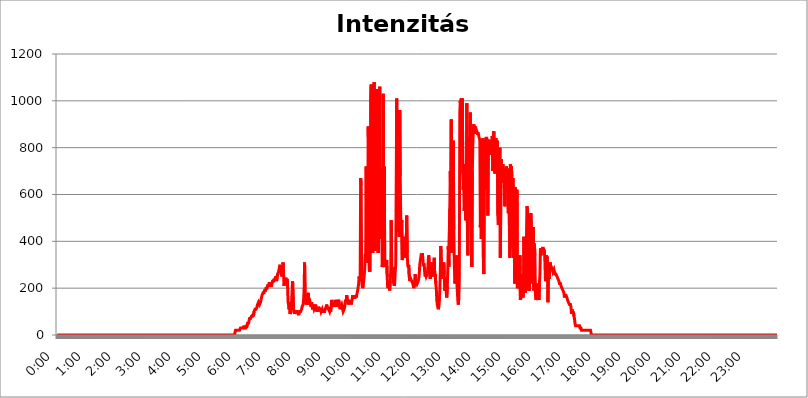
| Category | Intenzitás (W/m2) |
|---|---|
| 0.0 | 0 |
| 0.0006944444444444445 | 0 |
| 0.001388888888888889 | 0 |
| 0.0020833333333333333 | 0 |
| 0.002777777777777778 | 0 |
| 0.003472222222222222 | 0 |
| 0.004166666666666667 | 0 |
| 0.004861111111111111 | 0 |
| 0.005555555555555556 | 0 |
| 0.0062499999999999995 | 0 |
| 0.006944444444444444 | 0 |
| 0.007638888888888889 | 0 |
| 0.008333333333333333 | 0 |
| 0.009027777777777779 | 0 |
| 0.009722222222222222 | 0 |
| 0.010416666666666666 | 0 |
| 0.011111111111111112 | 0 |
| 0.011805555555555555 | 0 |
| 0.012499999999999999 | 0 |
| 0.013194444444444444 | 0 |
| 0.013888888888888888 | 0 |
| 0.014583333333333332 | 0 |
| 0.015277777777777777 | 0 |
| 0.015972222222222224 | 0 |
| 0.016666666666666666 | 0 |
| 0.017361111111111112 | 0 |
| 0.018055555555555557 | 0 |
| 0.01875 | 0 |
| 0.019444444444444445 | 0 |
| 0.02013888888888889 | 0 |
| 0.020833333333333332 | 0 |
| 0.02152777777777778 | 0 |
| 0.022222222222222223 | 0 |
| 0.02291666666666667 | 0 |
| 0.02361111111111111 | 0 |
| 0.024305555555555556 | 0 |
| 0.024999999999999998 | 0 |
| 0.025694444444444447 | 0 |
| 0.02638888888888889 | 0 |
| 0.027083333333333334 | 0 |
| 0.027777777777777776 | 0 |
| 0.02847222222222222 | 0 |
| 0.029166666666666664 | 0 |
| 0.029861111111111113 | 0 |
| 0.030555555555555555 | 0 |
| 0.03125 | 0 |
| 0.03194444444444445 | 0 |
| 0.03263888888888889 | 0 |
| 0.03333333333333333 | 0 |
| 0.034027777777777775 | 0 |
| 0.034722222222222224 | 0 |
| 0.035416666666666666 | 0 |
| 0.036111111111111115 | 0 |
| 0.03680555555555556 | 0 |
| 0.0375 | 0 |
| 0.03819444444444444 | 0 |
| 0.03888888888888889 | 0 |
| 0.03958333333333333 | 0 |
| 0.04027777777777778 | 0 |
| 0.04097222222222222 | 0 |
| 0.041666666666666664 | 0 |
| 0.042361111111111106 | 0 |
| 0.04305555555555556 | 0 |
| 0.043750000000000004 | 0 |
| 0.044444444444444446 | 0 |
| 0.04513888888888889 | 0 |
| 0.04583333333333334 | 0 |
| 0.04652777777777778 | 0 |
| 0.04722222222222222 | 0 |
| 0.04791666666666666 | 0 |
| 0.04861111111111111 | 0 |
| 0.049305555555555554 | 0 |
| 0.049999999999999996 | 0 |
| 0.05069444444444445 | 0 |
| 0.051388888888888894 | 0 |
| 0.052083333333333336 | 0 |
| 0.05277777777777778 | 0 |
| 0.05347222222222222 | 0 |
| 0.05416666666666667 | 0 |
| 0.05486111111111111 | 0 |
| 0.05555555555555555 | 0 |
| 0.05625 | 0 |
| 0.05694444444444444 | 0 |
| 0.057638888888888885 | 0 |
| 0.05833333333333333 | 0 |
| 0.05902777777777778 | 0 |
| 0.059722222222222225 | 0 |
| 0.06041666666666667 | 0 |
| 0.061111111111111116 | 0 |
| 0.06180555555555556 | 0 |
| 0.0625 | 0 |
| 0.06319444444444444 | 0 |
| 0.06388888888888888 | 0 |
| 0.06458333333333334 | 0 |
| 0.06527777777777778 | 0 |
| 0.06597222222222222 | 0 |
| 0.06666666666666667 | 0 |
| 0.06736111111111111 | 0 |
| 0.06805555555555555 | 0 |
| 0.06874999999999999 | 0 |
| 0.06944444444444443 | 0 |
| 0.07013888888888889 | 0 |
| 0.07083333333333333 | 0 |
| 0.07152777777777779 | 0 |
| 0.07222222222222223 | 0 |
| 0.07291666666666667 | 0 |
| 0.07361111111111111 | 0 |
| 0.07430555555555556 | 0 |
| 0.075 | 0 |
| 0.07569444444444444 | 0 |
| 0.0763888888888889 | 0 |
| 0.07708333333333334 | 0 |
| 0.07777777777777778 | 0 |
| 0.07847222222222222 | 0 |
| 0.07916666666666666 | 0 |
| 0.0798611111111111 | 0 |
| 0.08055555555555556 | 0 |
| 0.08125 | 0 |
| 0.08194444444444444 | 0 |
| 0.08263888888888889 | 0 |
| 0.08333333333333333 | 0 |
| 0.08402777777777777 | 0 |
| 0.08472222222222221 | 0 |
| 0.08541666666666665 | 0 |
| 0.08611111111111112 | 0 |
| 0.08680555555555557 | 0 |
| 0.08750000000000001 | 0 |
| 0.08819444444444445 | 0 |
| 0.08888888888888889 | 0 |
| 0.08958333333333333 | 0 |
| 0.09027777777777778 | 0 |
| 0.09097222222222222 | 0 |
| 0.09166666666666667 | 0 |
| 0.09236111111111112 | 0 |
| 0.09305555555555556 | 0 |
| 0.09375 | 0 |
| 0.09444444444444444 | 0 |
| 0.09513888888888888 | 0 |
| 0.09583333333333333 | 0 |
| 0.09652777777777777 | 0 |
| 0.09722222222222222 | 0 |
| 0.09791666666666667 | 0 |
| 0.09861111111111111 | 0 |
| 0.09930555555555555 | 0 |
| 0.09999999999999999 | 0 |
| 0.10069444444444443 | 0 |
| 0.1013888888888889 | 0 |
| 0.10208333333333335 | 0 |
| 0.10277777777777779 | 0 |
| 0.10347222222222223 | 0 |
| 0.10416666666666667 | 0 |
| 0.10486111111111111 | 0 |
| 0.10555555555555556 | 0 |
| 0.10625 | 0 |
| 0.10694444444444444 | 0 |
| 0.1076388888888889 | 0 |
| 0.10833333333333334 | 0 |
| 0.10902777777777778 | 0 |
| 0.10972222222222222 | 0 |
| 0.1111111111111111 | 0 |
| 0.11180555555555556 | 0 |
| 0.11180555555555556 | 0 |
| 0.1125 | 0 |
| 0.11319444444444444 | 0 |
| 0.11388888888888889 | 0 |
| 0.11458333333333333 | 0 |
| 0.11527777777777777 | 0 |
| 0.11597222222222221 | 0 |
| 0.11666666666666665 | 0 |
| 0.1173611111111111 | 0 |
| 0.11805555555555557 | 0 |
| 0.11944444444444445 | 0 |
| 0.12013888888888889 | 0 |
| 0.12083333333333333 | 0 |
| 0.12152777777777778 | 0 |
| 0.12222222222222223 | 0 |
| 0.12291666666666667 | 0 |
| 0.12291666666666667 | 0 |
| 0.12361111111111112 | 0 |
| 0.12430555555555556 | 0 |
| 0.125 | 0 |
| 0.12569444444444444 | 0 |
| 0.12638888888888888 | 0 |
| 0.12708333333333333 | 0 |
| 0.16875 | 0 |
| 0.12847222222222224 | 0 |
| 0.12916666666666668 | 0 |
| 0.12986111111111112 | 0 |
| 0.13055555555555556 | 0 |
| 0.13125 | 0 |
| 0.13194444444444445 | 0 |
| 0.1326388888888889 | 0 |
| 0.13333333333333333 | 0 |
| 0.13402777777777777 | 0 |
| 0.13402777777777777 | 0 |
| 0.13472222222222222 | 0 |
| 0.13541666666666666 | 0 |
| 0.1361111111111111 | 0 |
| 0.13749999999999998 | 0 |
| 0.13819444444444443 | 0 |
| 0.1388888888888889 | 0 |
| 0.13958333333333334 | 0 |
| 0.14027777777777778 | 0 |
| 0.14097222222222222 | 0 |
| 0.14166666666666666 | 0 |
| 0.1423611111111111 | 0 |
| 0.14305555555555557 | 0 |
| 0.14375000000000002 | 0 |
| 0.14444444444444446 | 0 |
| 0.1451388888888889 | 0 |
| 0.1451388888888889 | 0 |
| 0.14652777777777778 | 0 |
| 0.14722222222222223 | 0 |
| 0.14791666666666667 | 0 |
| 0.1486111111111111 | 0 |
| 0.14930555555555555 | 0 |
| 0.15 | 0 |
| 0.15069444444444444 | 0 |
| 0.15138888888888888 | 0 |
| 0.15208333333333332 | 0 |
| 0.15277777777777776 | 0 |
| 0.15347222222222223 | 0 |
| 0.15416666666666667 | 0 |
| 0.15486111111111112 | 0 |
| 0.15555555555555556 | 0 |
| 0.15625 | 0 |
| 0.15694444444444444 | 0 |
| 0.15763888888888888 | 0 |
| 0.15833333333333333 | 0 |
| 0.15902777777777777 | 0 |
| 0.15972222222222224 | 0 |
| 0.16041666666666668 | 0 |
| 0.16111111111111112 | 0 |
| 0.16180555555555556 | 0 |
| 0.1625 | 0 |
| 0.16319444444444445 | 0 |
| 0.1638888888888889 | 0 |
| 0.16458333333333333 | 0 |
| 0.16527777777777777 | 0 |
| 0.16597222222222222 | 0 |
| 0.16666666666666666 | 0 |
| 0.1673611111111111 | 0 |
| 0.16805555555555554 | 0 |
| 0.16874999999999998 | 0 |
| 0.16944444444444443 | 0 |
| 0.17013888888888887 | 0 |
| 0.1708333333333333 | 0 |
| 0.17152777777777775 | 0 |
| 0.17222222222222225 | 0 |
| 0.1729166666666667 | 0 |
| 0.17361111111111113 | 0 |
| 0.17430555555555557 | 0 |
| 0.17500000000000002 | 0 |
| 0.17569444444444446 | 0 |
| 0.1763888888888889 | 0 |
| 0.17708333333333334 | 0 |
| 0.17777777777777778 | 0 |
| 0.17847222222222223 | 0 |
| 0.17916666666666667 | 0 |
| 0.1798611111111111 | 0 |
| 0.18055555555555555 | 0 |
| 0.18125 | 0 |
| 0.18194444444444444 | 0 |
| 0.1826388888888889 | 0 |
| 0.18333333333333335 | 0 |
| 0.1840277777777778 | 0 |
| 0.18472222222222223 | 0 |
| 0.18541666666666667 | 0 |
| 0.18611111111111112 | 0 |
| 0.18680555555555556 | 0 |
| 0.1875 | 0 |
| 0.18819444444444444 | 0 |
| 0.18888888888888888 | 0 |
| 0.18958333333333333 | 0 |
| 0.19027777777777777 | 0 |
| 0.1909722222222222 | 0 |
| 0.19166666666666665 | 0 |
| 0.19236111111111112 | 0 |
| 0.19305555555555554 | 0 |
| 0.19375 | 0 |
| 0.19444444444444445 | 0 |
| 0.1951388888888889 | 0 |
| 0.19583333333333333 | 0 |
| 0.19652777777777777 | 0 |
| 0.19722222222222222 | 0 |
| 0.19791666666666666 | 0 |
| 0.1986111111111111 | 0 |
| 0.19930555555555554 | 0 |
| 0.19999999999999998 | 0 |
| 0.20069444444444443 | 0 |
| 0.20138888888888887 | 0 |
| 0.2020833333333333 | 0 |
| 0.2027777777777778 | 0 |
| 0.2034722222222222 | 0 |
| 0.2041666666666667 | 0 |
| 0.20486111111111113 | 0 |
| 0.20555555555555557 | 0 |
| 0.20625000000000002 | 0 |
| 0.20694444444444446 | 0 |
| 0.2076388888888889 | 0 |
| 0.20833333333333334 | 0 |
| 0.20902777777777778 | 0 |
| 0.20972222222222223 | 0 |
| 0.21041666666666667 | 0 |
| 0.2111111111111111 | 0 |
| 0.21180555555555555 | 0 |
| 0.2125 | 0 |
| 0.21319444444444444 | 0 |
| 0.2138888888888889 | 0 |
| 0.21458333333333335 | 0 |
| 0.2152777777777778 | 0 |
| 0.21597222222222223 | 0 |
| 0.21666666666666667 | 0 |
| 0.21736111111111112 | 0 |
| 0.21805555555555556 | 0 |
| 0.21875 | 0 |
| 0.21944444444444444 | 0 |
| 0.22013888888888888 | 0 |
| 0.22083333333333333 | 0 |
| 0.22152777777777777 | 0 |
| 0.2222222222222222 | 0 |
| 0.22291666666666665 | 0 |
| 0.2236111111111111 | 0 |
| 0.22430555555555556 | 0 |
| 0.225 | 0 |
| 0.22569444444444445 | 0 |
| 0.2263888888888889 | 0 |
| 0.22708333333333333 | 0 |
| 0.22777777777777777 | 0 |
| 0.22847222222222222 | 0 |
| 0.22916666666666666 | 0 |
| 0.2298611111111111 | 0 |
| 0.23055555555555554 | 0 |
| 0.23124999999999998 | 0 |
| 0.23194444444444443 | 0 |
| 0.23263888888888887 | 0 |
| 0.2333333333333333 | 0 |
| 0.2340277777777778 | 0 |
| 0.2347222222222222 | 0 |
| 0.2354166666666667 | 0 |
| 0.23611111111111113 | 0 |
| 0.23680555555555557 | 0 |
| 0.23750000000000002 | 0 |
| 0.23819444444444446 | 0 |
| 0.2388888888888889 | 0 |
| 0.23958333333333334 | 0 |
| 0.24027777777777778 | 0 |
| 0.24097222222222223 | 0 |
| 0.24166666666666667 | 0 |
| 0.2423611111111111 | 0 |
| 0.24305555555555555 | 0 |
| 0.24375 | 0 |
| 0.24444444444444446 | 0 |
| 0.24513888888888888 | 0 |
| 0.24583333333333335 | 0 |
| 0.2465277777777778 | 0 |
| 0.24722222222222223 | 20 |
| 0.24791666666666667 | 20 |
| 0.24861111111111112 | 20 |
| 0.24930555555555556 | 20 |
| 0.25 | 20 |
| 0.25069444444444444 | 20 |
| 0.2513888888888889 | 20 |
| 0.2520833333333333 | 20 |
| 0.25277777777777777 | 20 |
| 0.2534722222222222 | 20 |
| 0.25416666666666665 | 30 |
| 0.2548611111111111 | 30 |
| 0.2555555555555556 | 30 |
| 0.25625000000000003 | 30 |
| 0.2569444444444445 | 30 |
| 0.2576388888888889 | 30 |
| 0.25833333333333336 | 30 |
| 0.2590277777777778 | 40 |
| 0.25972222222222224 | 30 |
| 0.2604166666666667 | 30 |
| 0.2611111111111111 | 30 |
| 0.26180555555555557 | 40 |
| 0.2625 | 30 |
| 0.26319444444444445 | 30 |
| 0.2638888888888889 | 50 |
| 0.26458333333333334 | 50 |
| 0.2652777777777778 | 50 |
| 0.2659722222222222 | 60 |
| 0.26666666666666666 | 70 |
| 0.2673611111111111 | 70 |
| 0.26805555555555555 | 70 |
| 0.26875 | 70 |
| 0.26944444444444443 | 80 |
| 0.2701388888888889 | 80 |
| 0.2708333333333333 | 80 |
| 0.27152777777777776 | 90 |
| 0.2722222222222222 | 80 |
| 0.27291666666666664 | 100 |
| 0.2736111111111111 | 100 |
| 0.2743055555555555 | 110 |
| 0.27499999999999997 | 110 |
| 0.27569444444444446 | 110 |
| 0.27638888888888885 | 110 |
| 0.27708333333333335 | 120 |
| 0.2777777777777778 | 130 |
| 0.27847222222222223 | 130 |
| 0.2791666666666667 | 140 |
| 0.2798611111111111 | 140 |
| 0.28055555555555556 | 130 |
| 0.28125 | 130 |
| 0.28194444444444444 | 140 |
| 0.2826388888888889 | 150 |
| 0.2833333333333333 | 160 |
| 0.28402777777777777 | 170 |
| 0.2847222222222222 | 170 |
| 0.28541666666666665 | 180 |
| 0.28611111111111115 | 180 |
| 0.28680555555555554 | 180 |
| 0.28750000000000003 | 190 |
| 0.2881944444444445 | 190 |
| 0.2888888888888889 | 190 |
| 0.28958333333333336 | 200 |
| 0.2902777777777778 | 200 |
| 0.29097222222222224 | 200 |
| 0.2916666666666667 | 210 |
| 0.2923611111111111 | 210 |
| 0.29305555555555557 | 210 |
| 0.29375 | 220 |
| 0.29444444444444445 | 220 |
| 0.2951388888888889 | 220 |
| 0.29583333333333334 | 210 |
| 0.2965277777777778 | 210 |
| 0.2972222222222222 | 210 |
| 0.29791666666666666 | 220 |
| 0.2986111111111111 | 230 |
| 0.29930555555555555 | 230 |
| 0.3 | 230 |
| 0.30069444444444443 | 240 |
| 0.3013888888888889 | 230 |
| 0.3020833333333333 | 240 |
| 0.30277777777777776 | 250 |
| 0.3034722222222222 | 240 |
| 0.30416666666666664 | 230 |
| 0.3048611111111111 | 230 |
| 0.3055555555555555 | 260 |
| 0.30624999999999997 | 260 |
| 0.3069444444444444 | 270 |
| 0.3076388888888889 | 270 |
| 0.30833333333333335 | 290 |
| 0.3090277777777778 | 300 |
| 0.30972222222222223 | 270 |
| 0.3104166666666667 | 260 |
| 0.3111111111111111 | 260 |
| 0.31180555555555556 | 250 |
| 0.3125 | 270 |
| 0.31319444444444444 | 310 |
| 0.3138888888888889 | 260 |
| 0.3145833333333333 | 210 |
| 0.31527777777777777 | 230 |
| 0.3159722222222222 | 240 |
| 0.31666666666666665 | 240 |
| 0.31736111111111115 | 240 |
| 0.31805555555555554 | 220 |
| 0.31875000000000003 | 240 |
| 0.3194444444444445 | 210 |
| 0.3201388888888889 | 140 |
| 0.32083333333333336 | 130 |
| 0.3215277777777778 | 110 |
| 0.32222222222222224 | 140 |
| 0.3229166666666667 | 90 |
| 0.3236111111111111 | 90 |
| 0.32430555555555557 | 100 |
| 0.325 | 140 |
| 0.32569444444444445 | 140 |
| 0.3263888888888889 | 230 |
| 0.32708333333333334 | 230 |
| 0.3277777777777778 | 110 |
| 0.3284722222222222 | 100 |
| 0.32916666666666666 | 90 |
| 0.3298611111111111 | 100 |
| 0.33055555555555555 | 100 |
| 0.33125 | 100 |
| 0.33194444444444443 | 100 |
| 0.3326388888888889 | 100 |
| 0.3333333333333333 | 100 |
| 0.3340277777777778 | 90 |
| 0.3347222222222222 | 90 |
| 0.3354166666666667 | 90 |
| 0.3361111111111111 | 100 |
| 0.3368055555555556 | 100 |
| 0.33749999999999997 | 100 |
| 0.33819444444444446 | 100 |
| 0.33888888888888885 | 110 |
| 0.33958333333333335 | 120 |
| 0.34027777777777773 | 120 |
| 0.34097222222222223 | 130 |
| 0.3416666666666666 | 150 |
| 0.3423611111111111 | 190 |
| 0.3430555555555555 | 310 |
| 0.34375 | 160 |
| 0.3444444444444445 | 140 |
| 0.3451388888888889 | 130 |
| 0.3458333333333334 | 130 |
| 0.34652777777777777 | 150 |
| 0.34722222222222227 | 130 |
| 0.34791666666666665 | 180 |
| 0.34861111111111115 | 150 |
| 0.34930555555555554 | 130 |
| 0.35000000000000003 | 130 |
| 0.3506944444444444 | 140 |
| 0.3513888888888889 | 130 |
| 0.3520833333333333 | 120 |
| 0.3527777777777778 | 140 |
| 0.3534722222222222 | 140 |
| 0.3541666666666667 | 110 |
| 0.3548611111111111 | 130 |
| 0.35555555555555557 | 120 |
| 0.35625 | 110 |
| 0.35694444444444445 | 110 |
| 0.3576388888888889 | 120 |
| 0.35833333333333334 | 130 |
| 0.3590277777777778 | 110 |
| 0.3597222222222222 | 100 |
| 0.36041666666666666 | 100 |
| 0.3611111111111111 | 120 |
| 0.36180555555555555 | 100 |
| 0.3625 | 120 |
| 0.36319444444444443 | 120 |
| 0.3638888888888889 | 110 |
| 0.3645833333333333 | 110 |
| 0.3652777777777778 | 110 |
| 0.3659722222222222 | 100 |
| 0.3666666666666667 | 100 |
| 0.3673611111111111 | 110 |
| 0.3680555555555556 | 100 |
| 0.36874999999999997 | 100 |
| 0.36944444444444446 | 100 |
| 0.37013888888888885 | 100 |
| 0.37083333333333335 | 100 |
| 0.37152777777777773 | 110 |
| 0.37222222222222223 | 110 |
| 0.3729166666666666 | 120 |
| 0.3736111111111111 | 130 |
| 0.3743055555555555 | 120 |
| 0.375 | 110 |
| 0.3756944444444445 | 120 |
| 0.3763888888888889 | 110 |
| 0.3770833333333334 | 110 |
| 0.37777777777777777 | 100 |
| 0.37847222222222227 | 110 |
| 0.37916666666666665 | 100 |
| 0.37986111111111115 | 120 |
| 0.38055555555555554 | 150 |
| 0.38125000000000003 | 120 |
| 0.3819444444444444 | 120 |
| 0.3826388888888889 | 140 |
| 0.3833333333333333 | 130 |
| 0.3840277777777778 | 120 |
| 0.3847222222222222 | 130 |
| 0.3854166666666667 | 150 |
| 0.3861111111111111 | 150 |
| 0.38680555555555557 | 120 |
| 0.3875 | 130 |
| 0.38819444444444445 | 140 |
| 0.3888888888888889 | 150 |
| 0.38958333333333334 | 140 |
| 0.3902777777777778 | 150 |
| 0.3909722222222222 | 140 |
| 0.39166666666666666 | 120 |
| 0.3923611111111111 | 110 |
| 0.39305555555555555 | 120 |
| 0.39375 | 120 |
| 0.39444444444444443 | 130 |
| 0.3951388888888889 | 120 |
| 0.3958333333333333 | 110 |
| 0.3965277777777778 | 100 |
| 0.3972222222222222 | 100 |
| 0.3979166666666667 | 110 |
| 0.3986111111111111 | 120 |
| 0.3993055555555556 | 140 |
| 0.39999999999999997 | 150 |
| 0.40069444444444446 | 140 |
| 0.40138888888888885 | 170 |
| 0.40208333333333335 | 160 |
| 0.40277777777777773 | 150 |
| 0.40347222222222223 | 130 |
| 0.4041666666666666 | 140 |
| 0.4048611111111111 | 150 |
| 0.4055555555555555 | 140 |
| 0.40625 | 140 |
| 0.4069444444444445 | 140 |
| 0.4076388888888889 | 130 |
| 0.4083333333333334 | 140 |
| 0.40902777777777777 | 150 |
| 0.40972222222222227 | 170 |
| 0.41041666666666665 | 160 |
| 0.41111111111111115 | 160 |
| 0.41180555555555554 | 160 |
| 0.41250000000000003 | 160 |
| 0.4131944444444444 | 160 |
| 0.4138888888888889 | 170 |
| 0.4145833333333333 | 160 |
| 0.4152777777777778 | 170 |
| 0.4159722222222222 | 180 |
| 0.4166666666666667 | 190 |
| 0.4173611111111111 | 190 |
| 0.41805555555555557 | 220 |
| 0.41875 | 250 |
| 0.41944444444444445 | 230 |
| 0.4201388888888889 | 250 |
| 0.42083333333333334 | 670 |
| 0.4215277777777778 | 640 |
| 0.4222222222222222 | 240 |
| 0.42291666666666666 | 210 |
| 0.4236111111111111 | 200 |
| 0.42430555555555555 | 210 |
| 0.425 | 230 |
| 0.42569444444444443 | 250 |
| 0.4263888888888889 | 280 |
| 0.4270833333333333 | 340 |
| 0.4277777777777778 | 350 |
| 0.4284722222222222 | 720 |
| 0.4291666666666667 | 310 |
| 0.4298611111111111 | 310 |
| 0.4305555555555556 | 320 |
| 0.43124999999999997 | 890 |
| 0.43194444444444446 | 780 |
| 0.43263888888888885 | 280 |
| 0.43333333333333335 | 270 |
| 0.43402777777777773 | 280 |
| 0.43472222222222223 | 1020 |
| 0.4354166666666666 | 1070 |
| 0.4361111111111111 | 380 |
| 0.4368055555555555 | 390 |
| 0.4375 | 350 |
| 0.4381944444444445 | 1010 |
| 0.4388888888888889 | 1030 |
| 0.4395833333333334 | 1080 |
| 0.44027777777777777 | 420 |
| 0.44097222222222227 | 360 |
| 0.44166666666666665 | 950 |
| 0.44236111111111115 | 650 |
| 0.44305555555555554 | 1050 |
| 0.44375000000000003 | 930 |
| 0.4444444444444444 | 990 |
| 0.4451388888888889 | 350 |
| 0.4458333333333333 | 1050 |
| 0.4465277777777778 | 670 |
| 0.4472222222222222 | 1060 |
| 0.4479166666666667 | 530 |
| 0.4486111111111111 | 410 |
| 0.44930555555555557 | 710 |
| 0.45 | 590 |
| 0.45069444444444445 | 290 |
| 0.4513888888888889 | 310 |
| 0.45208333333333334 | 1030 |
| 0.4527777777777778 | 560 |
| 0.4534722222222222 | 720 |
| 0.45416666666666666 | 310 |
| 0.4548611111111111 | 290 |
| 0.45555555555555555 | 320 |
| 0.45625 | 310 |
| 0.45694444444444443 | 320 |
| 0.4576388888888889 | 250 |
| 0.4583333333333333 | 200 |
| 0.4590277777777778 | 200 |
| 0.4597222222222222 | 210 |
| 0.4604166666666667 | 210 |
| 0.4611111111111111 | 190 |
| 0.4618055555555556 | 230 |
| 0.46249999999999997 | 270 |
| 0.46319444444444446 | 490 |
| 0.46388888888888885 | 280 |
| 0.46458333333333335 | 290 |
| 0.46527777777777773 | 260 |
| 0.46597222222222223 | 230 |
| 0.4666666666666666 | 230 |
| 0.4673611111111111 | 210 |
| 0.4680555555555555 | 220 |
| 0.46875 | 270 |
| 0.4694444444444445 | 300 |
| 0.4701388888888889 | 650 |
| 0.4708333333333334 | 1010 |
| 0.47152777777777777 | 640 |
| 0.47222222222222227 | 530 |
| 0.47291666666666665 | 440 |
| 0.47361111111111115 | 670 |
| 0.47430555555555554 | 420 |
| 0.47500000000000003 | 960 |
| 0.4756944444444444 | 680 |
| 0.4763888888888889 | 510 |
| 0.4770833333333333 | 430 |
| 0.4777777777777778 | 490 |
| 0.4784722222222222 | 320 |
| 0.4791666666666667 | 330 |
| 0.4798611111111111 | 330 |
| 0.48055555555555557 | 350 |
| 0.48125 | 370 |
| 0.48194444444444445 | 420 |
| 0.4826388888888889 | 330 |
| 0.48333333333333334 | 380 |
| 0.4840277777777778 | 400 |
| 0.4847222222222222 | 510 |
| 0.48541666666666666 | 350 |
| 0.4861111111111111 | 300 |
| 0.48680555555555555 | 290 |
| 0.4875 | 300 |
| 0.48819444444444443 | 250 |
| 0.4888888888888889 | 230 |
| 0.4895833333333333 | 230 |
| 0.4902777777777778 | 240 |
| 0.4909722222222222 | 240 |
| 0.4916666666666667 | 230 |
| 0.4923611111111111 | 230 |
| 0.4930555555555556 | 220 |
| 0.49374999999999997 | 210 |
| 0.49444444444444446 | 200 |
| 0.49513888888888885 | 210 |
| 0.49583333333333335 | 240 |
| 0.49652777777777773 | 260 |
| 0.49722222222222223 | 230 |
| 0.4979166666666666 | 210 |
| 0.4986111111111111 | 230 |
| 0.4993055555555555 | 220 |
| 0.5 | 220 |
| 0.5006944444444444 | 230 |
| 0.5013888888888889 | 240 |
| 0.5020833333333333 | 260 |
| 0.5027777777777778 | 300 |
| 0.5034722222222222 | 300 |
| 0.5041666666666667 | 330 |
| 0.5048611111111111 | 330 |
| 0.5055555555555555 | 320 |
| 0.50625 | 350 |
| 0.5069444444444444 | 330 |
| 0.5076388888888889 | 300 |
| 0.5083333333333333 | 300 |
| 0.5090277777777777 | 300 |
| 0.5097222222222222 | 260 |
| 0.5104166666666666 | 250 |
| 0.5111111111111112 | 260 |
| 0.5118055555555555 | 250 |
| 0.5125000000000001 | 250 |
| 0.5131944444444444 | 260 |
| 0.513888888888889 | 280 |
| 0.5145833333333333 | 320 |
| 0.5152777777777778 | 340 |
| 0.5159722222222222 | 300 |
| 0.5166666666666667 | 250 |
| 0.517361111111111 | 240 |
| 0.5180555555555556 | 260 |
| 0.5187499999999999 | 280 |
| 0.5194444444444445 | 300 |
| 0.5201388888888888 | 310 |
| 0.5208333333333334 | 280 |
| 0.5215277777777778 | 250 |
| 0.5222222222222223 | 300 |
| 0.5229166666666667 | 330 |
| 0.5236111111111111 | 250 |
| 0.5243055555555556 | 260 |
| 0.525 | 220 |
| 0.5256944444444445 | 200 |
| 0.5263888888888889 | 150 |
| 0.5270833333333333 | 130 |
| 0.5277777777777778 | 120 |
| 0.5284722222222222 | 110 |
| 0.5291666666666667 | 120 |
| 0.5298611111111111 | 140 |
| 0.5305555555555556 | 190 |
| 0.53125 | 260 |
| 0.5319444444444444 | 380 |
| 0.5326388888888889 | 310 |
| 0.5333333333333333 | 270 |
| 0.5340277777777778 | 240 |
| 0.5347222222222222 | 260 |
| 0.5354166666666667 | 260 |
| 0.5361111111111111 | 310 |
| 0.5368055555555555 | 260 |
| 0.5375 | 190 |
| 0.5381944444444444 | 220 |
| 0.5388888888888889 | 210 |
| 0.5395833333333333 | 180 |
| 0.5402777777777777 | 160 |
| 0.5409722222222222 | 210 |
| 0.5416666666666666 | 280 |
| 0.5423611111111112 | 380 |
| 0.5430555555555555 | 290 |
| 0.5437500000000001 | 290 |
| 0.5444444444444444 | 540 |
| 0.545138888888889 | 700 |
| 0.5458333333333333 | 560 |
| 0.5465277777777778 | 920 |
| 0.5472222222222222 | 350 |
| 0.5479166666666667 | 780 |
| 0.548611111111111 | 400 |
| 0.5493055555555556 | 830 |
| 0.5499999999999999 | 450 |
| 0.5506944444444445 | 310 |
| 0.5513888888888888 | 220 |
| 0.5520833333333334 | 230 |
| 0.5527777777777778 | 310 |
| 0.5534722222222223 | 340 |
| 0.5541666666666667 | 230 |
| 0.5548611111111111 | 190 |
| 0.5555555555555556 | 150 |
| 0.55625 | 130 |
| 0.5569444444444445 | 160 |
| 0.5576388888888889 | 230 |
| 0.5583333333333333 | 950 |
| 0.5590277777777778 | 1000 |
| 0.5597222222222222 | 940 |
| 0.5604166666666667 | 1010 |
| 0.5611111111111111 | 810 |
| 0.5618055555555556 | 1010 |
| 0.5625 | 690 |
| 0.5631944444444444 | 620 |
| 0.5638888888888889 | 730 |
| 0.5645833333333333 | 530 |
| 0.5652777777777778 | 620 |
| 0.5659722222222222 | 650 |
| 0.5666666666666667 | 490 |
| 0.5673611111111111 | 590 |
| 0.5680555555555555 | 990 |
| 0.56875 | 480 |
| 0.5694444444444444 | 340 |
| 0.5701388888888889 | 530 |
| 0.5708333333333333 | 540 |
| 0.5715277777777777 | 830 |
| 0.5722222222222222 | 850 |
| 0.5729166666666666 | 950 |
| 0.5736111111111112 | 500 |
| 0.5743055555555555 | 540 |
| 0.5750000000000001 | 290 |
| 0.5756944444444444 | 700 |
| 0.576388888888889 | 810 |
| 0.5770833333333333 | 880 |
| 0.5777777777777778 | 900 |
| 0.5784722222222222 | 870 |
| 0.5791666666666667 | 860 |
| 0.579861111111111 | 890 |
| 0.5805555555555556 | 880 |
| 0.5812499999999999 | 880 |
| 0.5819444444444445 | 870 |
| 0.5826388888888888 | 860 |
| 0.5833333333333334 | 860 |
| 0.5840277777777778 | 860 |
| 0.5847222222222223 | 850 |
| 0.5854166666666667 | 840 |
| 0.5861111111111111 | 830 |
| 0.5868055555555556 | 460 |
| 0.5875 | 560 |
| 0.5881944444444445 | 410 |
| 0.5888888888888889 | 560 |
| 0.5895833333333333 | 820 |
| 0.5902777777777778 | 840 |
| 0.5909722222222222 | 330 |
| 0.5916666666666667 | 260 |
| 0.5923611111111111 | 810 |
| 0.5930555555555556 | 620 |
| 0.59375 | 830 |
| 0.5944444444444444 | 840 |
| 0.5951388888888889 | 840 |
| 0.5958333333333333 | 840 |
| 0.5965277777777778 | 830 |
| 0.5972222222222222 | 510 |
| 0.5979166666666667 | 830 |
| 0.5986111111111111 | 830 |
| 0.5993055555555555 | 830 |
| 0.6 | 820 |
| 0.6006944444444444 | 830 |
| 0.6013888888888889 | 770 |
| 0.6020833333333333 | 820 |
| 0.6027777777777777 | 800 |
| 0.6034722222222222 | 850 |
| 0.6041666666666666 | 700 |
| 0.6048611111111112 | 850 |
| 0.6055555555555555 | 870 |
| 0.6062500000000001 | 780 |
| 0.6069444444444444 | 690 |
| 0.607638888888889 | 830 |
| 0.6083333333333333 | 840 |
| 0.6090277777777778 | 830 |
| 0.6097222222222222 | 730 |
| 0.6104166666666667 | 830 |
| 0.611111111111111 | 510 |
| 0.6118055555555556 | 470 |
| 0.6124999999999999 | 670 |
| 0.6131944444444445 | 710 |
| 0.6138888888888888 | 800 |
| 0.6145833333333334 | 330 |
| 0.6152777777777778 | 640 |
| 0.6159722222222223 | 750 |
| 0.6166666666666667 | 690 |
| 0.6173611111111111 | 680 |
| 0.6180555555555556 | 730 |
| 0.61875 | 650 |
| 0.6194444444444445 | 710 |
| 0.6201388888888889 | 710 |
| 0.6208333333333333 | 550 |
| 0.6215277777777778 | 690 |
| 0.6222222222222222 | 710 |
| 0.6229166666666667 | 720 |
| 0.6236111111111111 | 700 |
| 0.6243055555555556 | 710 |
| 0.625 | 710 |
| 0.6256944444444444 | 520 |
| 0.6263888888888889 | 710 |
| 0.6270833333333333 | 470 |
| 0.6277777777777778 | 330 |
| 0.6284722222222222 | 730 |
| 0.6291666666666667 | 630 |
| 0.6298611111111111 | 720 |
| 0.6305555555555555 | 680 |
| 0.63125 | 370 |
| 0.6319444444444444 | 670 |
| 0.6326388888888889 | 330 |
| 0.6333333333333333 | 460 |
| 0.6340277777777777 | 540 |
| 0.6347222222222222 | 220 |
| 0.6354166666666666 | 630 |
| 0.6361111111111112 | 630 |
| 0.6368055555555555 | 250 |
| 0.6375000000000001 | 620 |
| 0.6381944444444444 | 200 |
| 0.638888888888889 | 220 |
| 0.6395833333333333 | 220 |
| 0.6402777777777778 | 310 |
| 0.6409722222222222 | 220 |
| 0.6416666666666667 | 340 |
| 0.642361111111111 | 150 |
| 0.6430555555555556 | 150 |
| 0.6437499999999999 | 170 |
| 0.6444444444444445 | 260 |
| 0.6451388888888888 | 180 |
| 0.6458333333333334 | 160 |
| 0.6465277777777778 | 180 |
| 0.6472222222222223 | 420 |
| 0.6479166666666667 | 210 |
| 0.6486111111111111 | 200 |
| 0.6493055555555556 | 180 |
| 0.65 | 180 |
| 0.6506944444444445 | 390 |
| 0.6513888888888889 | 550 |
| 0.6520833333333333 | 540 |
| 0.6527777777777778 | 500 |
| 0.6534722222222222 | 190 |
| 0.6541666666666667 | 340 |
| 0.6548611111111111 | 190 |
| 0.6555555555555556 | 300 |
| 0.65625 | 510 |
| 0.6569444444444444 | 520 |
| 0.6576388888888889 | 460 |
| 0.6583333333333333 | 220 |
| 0.6590277777777778 | 230 |
| 0.6597222222222222 | 330 |
| 0.6604166666666667 | 460 |
| 0.6611111111111111 | 190 |
| 0.6618055555555555 | 390 |
| 0.6625 | 340 |
| 0.6631944444444444 | 170 |
| 0.6638888888888889 | 150 |
| 0.6645833333333333 | 150 |
| 0.6652777777777777 | 160 |
| 0.6659722222222222 | 220 |
| 0.6666666666666666 | 160 |
| 0.6673611111111111 | 190 |
| 0.6680555555555556 | 150 |
| 0.6687500000000001 | 220 |
| 0.6694444444444444 | 260 |
| 0.6701388888888888 | 370 |
| 0.6708333333333334 | 340 |
| 0.6715277777777778 | 370 |
| 0.6722222222222222 | 360 |
| 0.6729166666666666 | 370 |
| 0.6736111111111112 | 370 |
| 0.6743055555555556 | 370 |
| 0.6749999999999999 | 370 |
| 0.6756944444444444 | 360 |
| 0.6763888888888889 | 310 |
| 0.6770833333333334 | 230 |
| 0.6777777777777777 | 300 |
| 0.6784722222222223 | 340 |
| 0.6791666666666667 | 340 |
| 0.6798611111111111 | 330 |
| 0.6805555555555555 | 140 |
| 0.68125 | 310 |
| 0.6819444444444445 | 310 |
| 0.6826388888888889 | 240 |
| 0.6833333333333332 | 310 |
| 0.6840277777777778 | 300 |
| 0.6847222222222222 | 300 |
| 0.6854166666666667 | 290 |
| 0.686111111111111 | 290 |
| 0.6868055555555556 | 280 |
| 0.6875 | 270 |
| 0.6881944444444444 | 270 |
| 0.688888888888889 | 280 |
| 0.6895833333333333 | 270 |
| 0.6902777777777778 | 260 |
| 0.6909722222222222 | 260 |
| 0.6916666666666668 | 260 |
| 0.6923611111111111 | 260 |
| 0.6930555555555555 | 250 |
| 0.69375 | 250 |
| 0.6944444444444445 | 240 |
| 0.6951388888888889 | 240 |
| 0.6958333333333333 | 230 |
| 0.6965277777777777 | 220 |
| 0.6972222222222223 | 220 |
| 0.6979166666666666 | 220 |
| 0.6986111111111111 | 210 |
| 0.6993055555555556 | 210 |
| 0.7000000000000001 | 200 |
| 0.7006944444444444 | 200 |
| 0.7013888888888888 | 190 |
| 0.7020833333333334 | 190 |
| 0.7027777777777778 | 180 |
| 0.7034722222222222 | 160 |
| 0.7041666666666666 | 170 |
| 0.7048611111111112 | 170 |
| 0.7055555555555556 | 170 |
| 0.7062499999999999 | 170 |
| 0.7069444444444444 | 160 |
| 0.7076388888888889 | 150 |
| 0.7083333333333334 | 150 |
| 0.7090277777777777 | 140 |
| 0.7097222222222223 | 140 |
| 0.7104166666666667 | 130 |
| 0.7111111111111111 | 130 |
| 0.7118055555555555 | 130 |
| 0.7125 | 120 |
| 0.7131944444444445 | 90 |
| 0.7138888888888889 | 110 |
| 0.7145833333333332 | 90 |
| 0.7152777777777778 | 90 |
| 0.7159722222222222 | 100 |
| 0.7166666666666667 | 80 |
| 0.717361111111111 | 70 |
| 0.7180555555555556 | 50 |
| 0.71875 | 40 |
| 0.7194444444444444 | 40 |
| 0.720138888888889 | 40 |
| 0.7208333333333333 | 40 |
| 0.7215277777777778 | 40 |
| 0.7222222222222222 | 40 |
| 0.7229166666666668 | 40 |
| 0.7236111111111111 | 40 |
| 0.7243055555555555 | 40 |
| 0.725 | 30 |
| 0.7256944444444445 | 30 |
| 0.7263888888888889 | 30 |
| 0.7270833333333333 | 20 |
| 0.7277777777777777 | 20 |
| 0.7284722222222223 | 20 |
| 0.7291666666666666 | 20 |
| 0.7298611111111111 | 20 |
| 0.7305555555555556 | 20 |
| 0.7312500000000001 | 20 |
| 0.7319444444444444 | 20 |
| 0.7326388888888888 | 20 |
| 0.7333333333333334 | 20 |
| 0.7340277777777778 | 20 |
| 0.7347222222222222 | 20 |
| 0.7354166666666666 | 20 |
| 0.7361111111111112 | 20 |
| 0.7368055555555556 | 20 |
| 0.7374999999999999 | 20 |
| 0.7381944444444444 | 20 |
| 0.7388888888888889 | 20 |
| 0.7395833333333334 | 20 |
| 0.7402777777777777 | 20 |
| 0.7409722222222223 | 0 |
| 0.7416666666666667 | 0 |
| 0.7423611111111111 | 0 |
| 0.7430555555555555 | 0 |
| 0.74375 | 0 |
| 0.7444444444444445 | 0 |
| 0.7451388888888889 | 0 |
| 0.7458333333333332 | 0 |
| 0.7465277777777778 | 0 |
| 0.7472222222222222 | 0 |
| 0.7479166666666667 | 0 |
| 0.748611111111111 | 0 |
| 0.7493055555555556 | 0 |
| 0.75 | 0 |
| 0.7506944444444444 | 0 |
| 0.751388888888889 | 0 |
| 0.7520833333333333 | 0 |
| 0.7527777777777778 | 0 |
| 0.7534722222222222 | 0 |
| 0.7541666666666668 | 0 |
| 0.7548611111111111 | 0 |
| 0.7555555555555555 | 0 |
| 0.75625 | 0 |
| 0.7569444444444445 | 0 |
| 0.7576388888888889 | 0 |
| 0.7583333333333333 | 0 |
| 0.7590277777777777 | 0 |
| 0.7597222222222223 | 0 |
| 0.7604166666666666 | 0 |
| 0.7611111111111111 | 0 |
| 0.7618055555555556 | 0 |
| 0.7625000000000001 | 0 |
| 0.7631944444444444 | 0 |
| 0.7638888888888888 | 0 |
| 0.7645833333333334 | 0 |
| 0.7652777777777778 | 0 |
| 0.7659722222222222 | 0 |
| 0.7666666666666666 | 0 |
| 0.7673611111111112 | 0 |
| 0.7680555555555556 | 0 |
| 0.7687499999999999 | 0 |
| 0.7694444444444444 | 0 |
| 0.7701388888888889 | 0 |
| 0.7708333333333334 | 0 |
| 0.7715277777777777 | 0 |
| 0.7722222222222223 | 0 |
| 0.7729166666666667 | 0 |
| 0.7736111111111111 | 0 |
| 0.7743055555555555 | 0 |
| 0.775 | 0 |
| 0.7756944444444445 | 0 |
| 0.7763888888888889 | 0 |
| 0.7770833333333332 | 0 |
| 0.7777777777777778 | 0 |
| 0.7784722222222222 | 0 |
| 0.7791666666666667 | 0 |
| 0.779861111111111 | 0 |
| 0.7805555555555556 | 0 |
| 0.78125 | 0 |
| 0.7819444444444444 | 0 |
| 0.782638888888889 | 0 |
| 0.7833333333333333 | 0 |
| 0.7840277777777778 | 0 |
| 0.7847222222222222 | 0 |
| 0.7854166666666668 | 0 |
| 0.7861111111111111 | 0 |
| 0.7868055555555555 | 0 |
| 0.7875 | 0 |
| 0.7881944444444445 | 0 |
| 0.7888888888888889 | 0 |
| 0.7895833333333333 | 0 |
| 0.7902777777777777 | 0 |
| 0.7909722222222223 | 0 |
| 0.7916666666666666 | 0 |
| 0.7923611111111111 | 0 |
| 0.7930555555555556 | 0 |
| 0.7937500000000001 | 0 |
| 0.7944444444444444 | 0 |
| 0.7951388888888888 | 0 |
| 0.7958333333333334 | 0 |
| 0.7965277777777778 | 0 |
| 0.7972222222222222 | 0 |
| 0.7979166666666666 | 0 |
| 0.7986111111111112 | 0 |
| 0.7993055555555556 | 0 |
| 0.7999999999999999 | 0 |
| 0.8006944444444444 | 0 |
| 0.8013888888888889 | 0 |
| 0.8020833333333334 | 0 |
| 0.8027777777777777 | 0 |
| 0.8034722222222223 | 0 |
| 0.8041666666666667 | 0 |
| 0.8048611111111111 | 0 |
| 0.8055555555555555 | 0 |
| 0.80625 | 0 |
| 0.8069444444444445 | 0 |
| 0.8076388888888889 | 0 |
| 0.8083333333333332 | 0 |
| 0.8090277777777778 | 0 |
| 0.8097222222222222 | 0 |
| 0.8104166666666667 | 0 |
| 0.811111111111111 | 0 |
| 0.8118055555555556 | 0 |
| 0.8125 | 0 |
| 0.8131944444444444 | 0 |
| 0.813888888888889 | 0 |
| 0.8145833333333333 | 0 |
| 0.8152777777777778 | 0 |
| 0.8159722222222222 | 0 |
| 0.8166666666666668 | 0 |
| 0.8173611111111111 | 0 |
| 0.8180555555555555 | 0 |
| 0.81875 | 0 |
| 0.8194444444444445 | 0 |
| 0.8201388888888889 | 0 |
| 0.8208333333333333 | 0 |
| 0.8215277777777777 | 0 |
| 0.8222222222222223 | 0 |
| 0.8229166666666666 | 0 |
| 0.8236111111111111 | 0 |
| 0.8243055555555556 | 0 |
| 0.8250000000000001 | 0 |
| 0.8256944444444444 | 0 |
| 0.8263888888888888 | 0 |
| 0.8270833333333334 | 0 |
| 0.8277777777777778 | 0 |
| 0.8284722222222222 | 0 |
| 0.8291666666666666 | 0 |
| 0.8298611111111112 | 0 |
| 0.8305555555555556 | 0 |
| 0.8312499999999999 | 0 |
| 0.8319444444444444 | 0 |
| 0.8326388888888889 | 0 |
| 0.8333333333333334 | 0 |
| 0.8340277777777777 | 0 |
| 0.8347222222222223 | 0 |
| 0.8354166666666667 | 0 |
| 0.8361111111111111 | 0 |
| 0.8368055555555555 | 0 |
| 0.8375 | 0 |
| 0.8381944444444445 | 0 |
| 0.8388888888888889 | 0 |
| 0.8395833333333332 | 0 |
| 0.8402777777777778 | 0 |
| 0.8409722222222222 | 0 |
| 0.8416666666666667 | 0 |
| 0.842361111111111 | 0 |
| 0.8430555555555556 | 0 |
| 0.84375 | 0 |
| 0.8444444444444444 | 0 |
| 0.845138888888889 | 0 |
| 0.8458333333333333 | 0 |
| 0.8465277777777778 | 0 |
| 0.8472222222222222 | 0 |
| 0.8479166666666668 | 0 |
| 0.8486111111111111 | 0 |
| 0.8493055555555555 | 0 |
| 0.85 | 0 |
| 0.8506944444444445 | 0 |
| 0.8513888888888889 | 0 |
| 0.8520833333333333 | 0 |
| 0.8527777777777777 | 0 |
| 0.8534722222222223 | 0 |
| 0.8541666666666666 | 0 |
| 0.8548611111111111 | 0 |
| 0.8555555555555556 | 0 |
| 0.8562500000000001 | 0 |
| 0.8569444444444444 | 0 |
| 0.8576388888888888 | 0 |
| 0.8583333333333334 | 0 |
| 0.8590277777777778 | 0 |
| 0.8597222222222222 | 0 |
| 0.8604166666666666 | 0 |
| 0.8611111111111112 | 0 |
| 0.8618055555555556 | 0 |
| 0.8624999999999999 | 0 |
| 0.8631944444444444 | 0 |
| 0.8638888888888889 | 0 |
| 0.8645833333333334 | 0 |
| 0.8652777777777777 | 0 |
| 0.8659722222222223 | 0 |
| 0.8666666666666667 | 0 |
| 0.8673611111111111 | 0 |
| 0.8680555555555555 | 0 |
| 0.86875 | 0 |
| 0.8694444444444445 | 0 |
| 0.8701388888888889 | 0 |
| 0.8708333333333332 | 0 |
| 0.8715277777777778 | 0 |
| 0.8722222222222222 | 0 |
| 0.8729166666666667 | 0 |
| 0.873611111111111 | 0 |
| 0.8743055555555556 | 0 |
| 0.875 | 0 |
| 0.8756944444444444 | 0 |
| 0.876388888888889 | 0 |
| 0.8770833333333333 | 0 |
| 0.8777777777777778 | 0 |
| 0.8784722222222222 | 0 |
| 0.8791666666666668 | 0 |
| 0.8798611111111111 | 0 |
| 0.8805555555555555 | 0 |
| 0.88125 | 0 |
| 0.8819444444444445 | 0 |
| 0.8826388888888889 | 0 |
| 0.8833333333333333 | 0 |
| 0.8840277777777777 | 0 |
| 0.8847222222222223 | 0 |
| 0.8854166666666666 | 0 |
| 0.8861111111111111 | 0 |
| 0.8868055555555556 | 0 |
| 0.8875000000000001 | 0 |
| 0.8881944444444444 | 0 |
| 0.8888888888888888 | 0 |
| 0.8895833333333334 | 0 |
| 0.8902777777777778 | 0 |
| 0.8909722222222222 | 0 |
| 0.8916666666666666 | 0 |
| 0.8923611111111112 | 0 |
| 0.8930555555555556 | 0 |
| 0.8937499999999999 | 0 |
| 0.8944444444444444 | 0 |
| 0.8951388888888889 | 0 |
| 0.8958333333333334 | 0 |
| 0.8965277777777777 | 0 |
| 0.8972222222222223 | 0 |
| 0.8979166666666667 | 0 |
| 0.8986111111111111 | 0 |
| 0.8993055555555555 | 0 |
| 0.9 | 0 |
| 0.9006944444444445 | 0 |
| 0.9013888888888889 | 0 |
| 0.9020833333333332 | 0 |
| 0.9027777777777778 | 0 |
| 0.9034722222222222 | 0 |
| 0.9041666666666667 | 0 |
| 0.904861111111111 | 0 |
| 0.9055555555555556 | 0 |
| 0.90625 | 0 |
| 0.9069444444444444 | 0 |
| 0.907638888888889 | 0 |
| 0.9083333333333333 | 0 |
| 0.9090277777777778 | 0 |
| 0.9097222222222222 | 0 |
| 0.9104166666666668 | 0 |
| 0.9111111111111111 | 0 |
| 0.9118055555555555 | 0 |
| 0.9125 | 0 |
| 0.9131944444444445 | 0 |
| 0.9138888888888889 | 0 |
| 0.9145833333333333 | 0 |
| 0.9152777777777777 | 0 |
| 0.9159722222222223 | 0 |
| 0.9166666666666666 | 0 |
| 0.9173611111111111 | 0 |
| 0.9180555555555556 | 0 |
| 0.9187500000000001 | 0 |
| 0.9194444444444444 | 0 |
| 0.9201388888888888 | 0 |
| 0.9208333333333334 | 0 |
| 0.9215277777777778 | 0 |
| 0.9222222222222222 | 0 |
| 0.9229166666666666 | 0 |
| 0.9236111111111112 | 0 |
| 0.9243055555555556 | 0 |
| 0.9249999999999999 | 0 |
| 0.9256944444444444 | 0 |
| 0.9263888888888889 | 0 |
| 0.9270833333333334 | 0 |
| 0.9277777777777777 | 0 |
| 0.9284722222222223 | 0 |
| 0.9291666666666667 | 0 |
| 0.9298611111111111 | 0 |
| 0.9305555555555555 | 0 |
| 0.93125 | 0 |
| 0.9319444444444445 | 0 |
| 0.9326388888888889 | 0 |
| 0.9333333333333332 | 0 |
| 0.9340277777777778 | 0 |
| 0.9347222222222222 | 0 |
| 0.9354166666666667 | 0 |
| 0.936111111111111 | 0 |
| 0.9368055555555556 | 0 |
| 0.9375 | 0 |
| 0.9381944444444444 | 0 |
| 0.938888888888889 | 0 |
| 0.9395833333333333 | 0 |
| 0.9402777777777778 | 0 |
| 0.9409722222222222 | 0 |
| 0.9416666666666668 | 0 |
| 0.9423611111111111 | 0 |
| 0.9430555555555555 | 0 |
| 0.94375 | 0 |
| 0.9444444444444445 | 0 |
| 0.9451388888888889 | 0 |
| 0.9458333333333333 | 0 |
| 0.9465277777777777 | 0 |
| 0.9472222222222223 | 0 |
| 0.9479166666666666 | 0 |
| 0.9486111111111111 | 0 |
| 0.9493055555555556 | 0 |
| 0.9500000000000001 | 0 |
| 0.9506944444444444 | 0 |
| 0.9513888888888888 | 0 |
| 0.9520833333333334 | 0 |
| 0.9527777777777778 | 0 |
| 0.9534722222222222 | 0 |
| 0.9541666666666666 | 0 |
| 0.9548611111111112 | 0 |
| 0.9555555555555556 | 0 |
| 0.9562499999999999 | 0 |
| 0.9569444444444444 | 0 |
| 0.9576388888888889 | 0 |
| 0.9583333333333334 | 0 |
| 0.9590277777777777 | 0 |
| 0.9597222222222223 | 0 |
| 0.9604166666666667 | 0 |
| 0.9611111111111111 | 0 |
| 0.9618055555555555 | 0 |
| 0.9625 | 0 |
| 0.9631944444444445 | 0 |
| 0.9638888888888889 | 0 |
| 0.9645833333333332 | 0 |
| 0.9652777777777778 | 0 |
| 0.9659722222222222 | 0 |
| 0.9666666666666667 | 0 |
| 0.967361111111111 | 0 |
| 0.9680555555555556 | 0 |
| 0.96875 | 0 |
| 0.9694444444444444 | 0 |
| 0.970138888888889 | 0 |
| 0.9708333333333333 | 0 |
| 0.9715277777777778 | 0 |
| 0.9722222222222222 | 0 |
| 0.9729166666666668 | 0 |
| 0.9736111111111111 | 0 |
| 0.9743055555555555 | 0 |
| 0.975 | 0 |
| 0.9756944444444445 | 0 |
| 0.9763888888888889 | 0 |
| 0.9770833333333333 | 0 |
| 0.9777777777777777 | 0 |
| 0.9784722222222223 | 0 |
| 0.9791666666666666 | 0 |
| 0.9798611111111111 | 0 |
| 0.9805555555555556 | 0 |
| 0.9812500000000001 | 0 |
| 0.9819444444444444 | 0 |
| 0.9826388888888888 | 0 |
| 0.9833333333333334 | 0 |
| 0.9840277777777778 | 0 |
| 0.9847222222222222 | 0 |
| 0.9854166666666666 | 0 |
| 0.9861111111111112 | 0 |
| 0.9868055555555556 | 0 |
| 0.9874999999999999 | 0 |
| 0.9881944444444444 | 0 |
| 0.9888888888888889 | 0 |
| 0.9895833333333334 | 0 |
| 0.9902777777777777 | 0 |
| 0.9909722222222223 | 0 |
| 0.9916666666666667 | 0 |
| 0.9923611111111111 | 0 |
| 0.9930555555555555 | 0 |
| 0.99375 | 0 |
| 0.9944444444444445 | 0 |
| 0.9951388888888889 | 0 |
| 0.9958333333333332 | 0 |
| 0.9965277777777778 | 0 |
| 0.9972222222222222 | 0 |
| 0.9979166666666667 | 0 |
| 0.998611111111111 | 0 |
| 0.9993055555555556 | 0 |